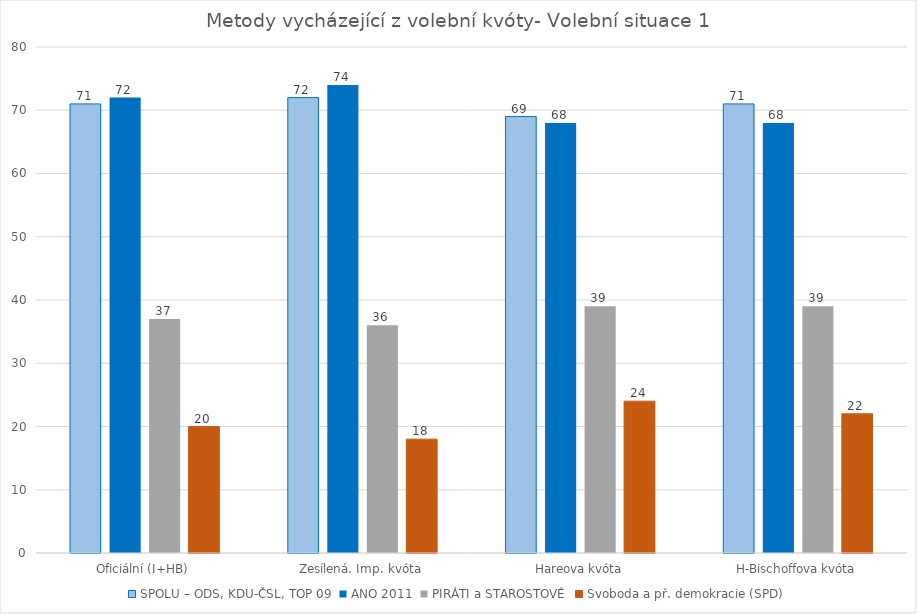
| Category | SPOLU – ODS, KDU-ČSL, TOP 09 | ANO 2011 | PIRÁTI a STAROSTOVÉ | Svoboda a př. demokracie (SPD) |
|---|---|---|---|---|
| Oficiální (I+HB) | 71 | 72 | 37 | 20 |
| Zesílená. Imp. kvóta | 72 | 74 | 36 | 18 |
| Hareova kvóta | 69 | 68 | 39 | 24 |
| H-Bischoffova kvóta | 71 | 68 | 39 | 22 |